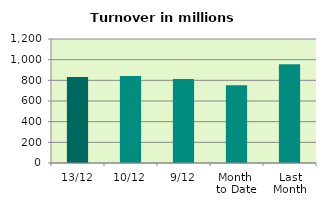
| Category | Series 0 |
|---|---|
| 13/12 | 831.376 |
| 10/12 | 840.982 |
| 9/12 | 813.756 |
| Month 
to Date | 753.379 |
| Last
Month | 954.978 |